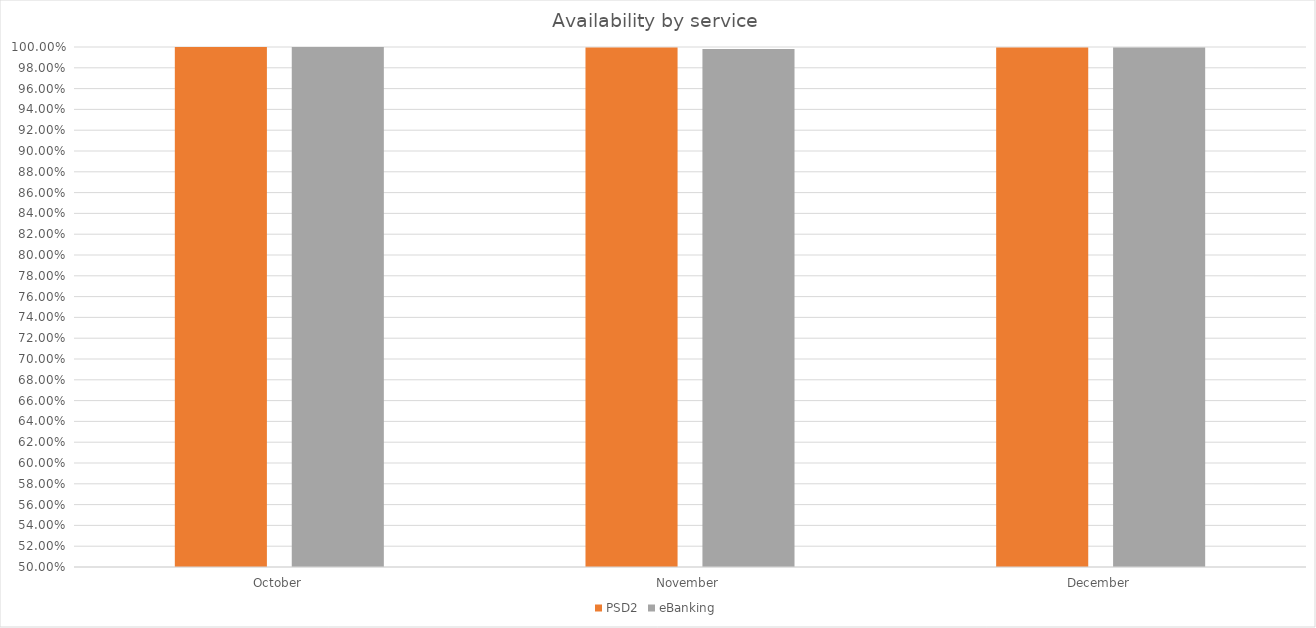
| Category | PSD2 | eBanking |
|---|---|---|
| October | 1 | 1 |
| November | 1 | 0.998 |
| December | 0.999 | 0.999 |